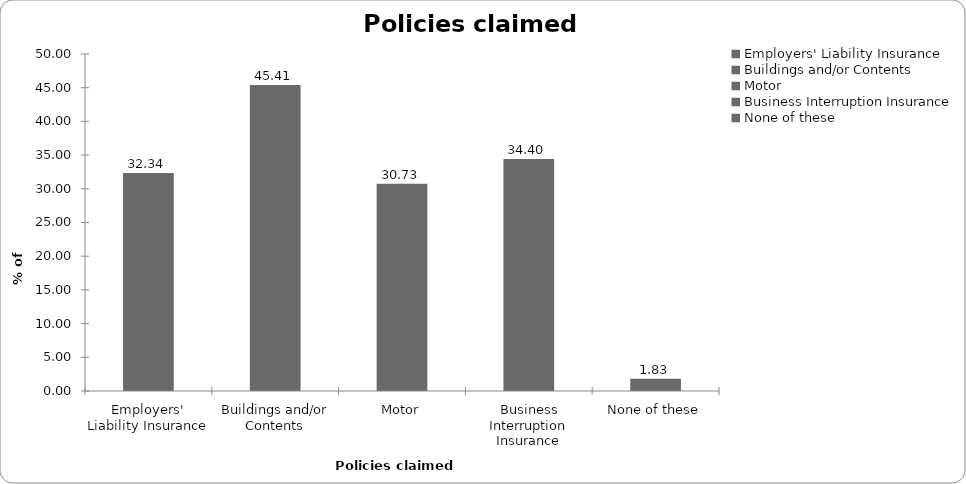
| Category | Series 0 |
|---|---|
| Employers' Liability Insurance | 32.339 |
| Buildings and/or Contents | 45.413 |
| Motor | 30.734 |
| Business Interruption Insurance | 34.404 |
| None of these | 1.835 |